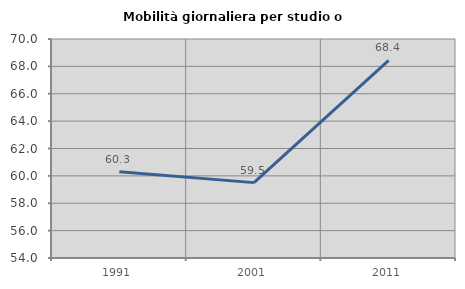
| Category | Mobilità giornaliera per studio o lavoro |
|---|---|
| 1991.0 | 60.309 |
| 2001.0 | 59.507 |
| 2011.0 | 68.431 |